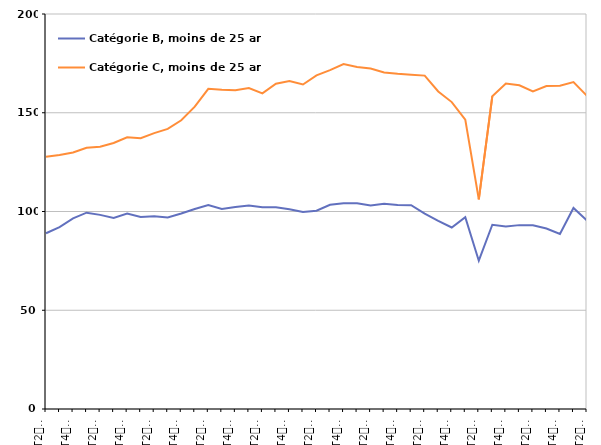
| Category | Catégorie B, moins de 25 ans | Catégorie C, moins de 25 ans |
|---|---|---|
| T2
2012 | 89 | 127.7 |
| T3
2012 | 92.1 | 128.6 |
| T4
2012 | 96.5 | 129.9 |
| T1
2013 | 99.4 | 132.3 |
| T2
2013 | 98.3 | 132.8 |
| T3
2013 | 96.7 | 134.7 |
| T4
2013 | 99 | 137.6 |
| T1
2014 | 97.2 | 137.1 |
| T2
2014 | 97.6 | 139.7 |
| T3
2014 | 97 | 141.8 |
| T4
2014 | 99 | 146.2 |
| T1
2015 | 101.3 | 153.1 |
| T2
2015 | 103.3 | 162.1 |
| T3
2015 | 101.3 | 161.6 |
| T4
2015 | 102.3 | 161.4 |
| T1
2016 | 103 | 162.5 |
| T2
2016 | 102.1 | 159.8 |
| T3
2016 | 102.2 | 164.7 |
| T4
2016 | 101.1 | 166.1 |
| T1
2017 | 99.7 | 164.3 |
| T2
2017 | 100.4 | 168.9 |
| T3
2017 | 103.4 | 171.6 |
| T4
2017 | 104.2 | 174.7 |
| T1
2018 | 104.2 | 173.2 |
| T2
2018 | 103 | 172.4 |
| T3
2018 | 103.9 | 170.4 |
| T4
2018 | 103.3 | 169.7 |
| T1
2019 | 103.2 | 169.3 |
| T2
2019 | 98.9 | 168.8 |
| T3
2019 | 95.3 | 160.8 |
| T4
2019 | 91.9 | 155.4 |
| T1
2020 | 97.1 | 146.5 |
| T2
2020 | 75.1 | 106.1 |
| T3
2020 | 93.3 | 158.4 |
| T4
2020 | 92.4 | 164.8 |
| T1
2021 | 93.1 | 163.9 |
| T2
2021 | 93 | 160.8 |
| T3
2021 | 91.4 | 163.5 |
| T4
2021 | 88.6 | 163.7 |
| T1
2022 | 101.8 | 165.5 |
| T2
2022 | 95.4 | 158.5 |